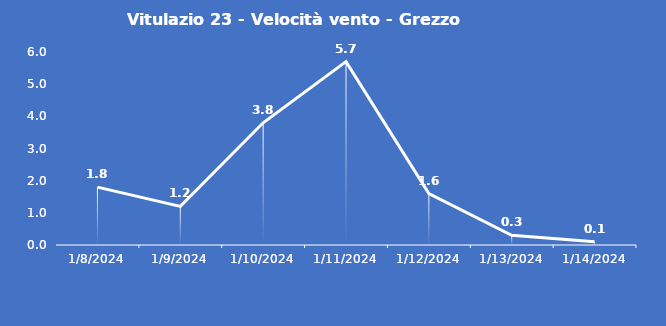
| Category | Vitulazio 23 - Velocità vento - Grezzo (m/s) |
|---|---|
| 1/8/24 | 1.8 |
| 1/9/24 | 1.2 |
| 1/10/24 | 3.8 |
| 1/11/24 | 5.7 |
| 1/12/24 | 1.6 |
| 1/13/24 | 0.3 |
| 1/14/24 | 0.1 |